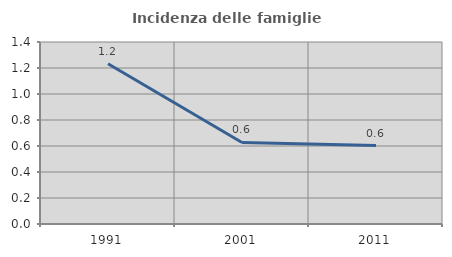
| Category | Incidenza delle famiglie numerose |
|---|---|
| 1991.0 | 1.232 |
| 2001.0 | 0.627 |
| 2011.0 | 0.603 |